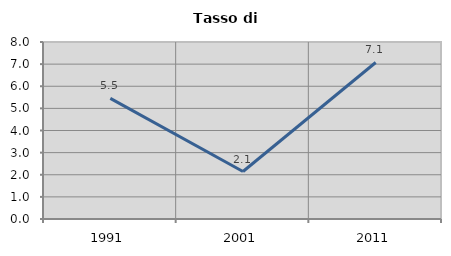
| Category | Tasso di disoccupazione   |
|---|---|
| 1991.0 | 5.452 |
| 2001.0 | 2.146 |
| 2011.0 | 7.075 |